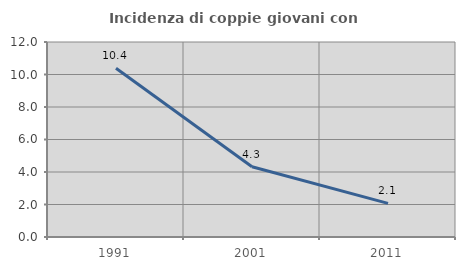
| Category | Incidenza di coppie giovani con figli |
|---|---|
| 1991.0 | 10.381 |
| 2001.0 | 4.327 |
| 2011.0 | 2.069 |